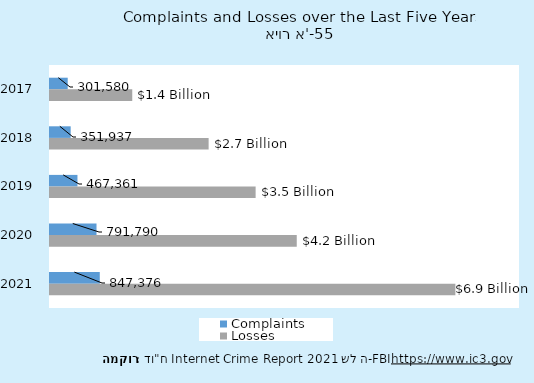
| Category | Complaints | Losses |
|---|---|---|
| 2017.0 | 301580 | 1400000 |
| 2018.0 | 351937 | 2700000 |
| 2019.0 | 467361 | 3500000 |
| 2020.0 | 791790 | 4200000 |
| 2021.0 | 847376 | 6900000 |